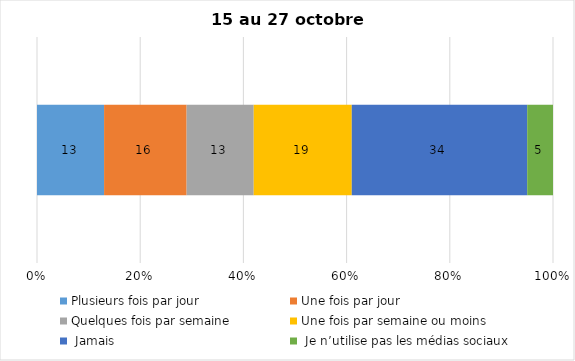
| Category | Plusieurs fois par jour | Une fois par jour | Quelques fois par semaine   | Une fois par semaine ou moins   |  Jamais   |  Je n’utilise pas les médias sociaux |
|---|---|---|---|---|---|---|
| 0 | 13 | 16 | 13 | 19 | 34 | 5 |